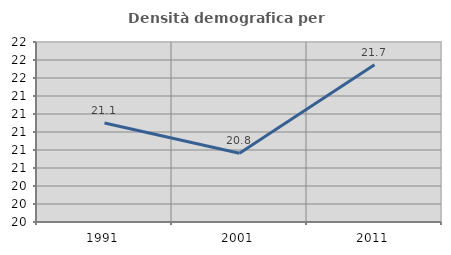
| Category | Densità demografica |
|---|---|
| 1991.0 | 21.101 |
| 2001.0 | 20.764 |
| 2011.0 | 21.748 |